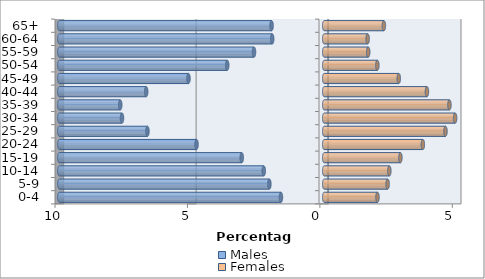
| Category | Males | Females |
|---|---|---|
| 0-4 | -1.634 | 2.011 |
| 5-9 | -2.071 | 2.394 |
| 10-14 | -2.283 | 2.459 |
| 15-19 | -3.113 | 2.876 |
| 20-24 | -4.821 | 3.724 |
| 25-29 | -6.674 | 4.578 |
| 30-34 | -7.635 | 4.942 |
| 35-39 | -7.701 | 4.727 |
| 40-44 | -6.721 | 3.878 |
| 45-49 | -5.124 | 2.814 |
| 50-54 | -3.662 | 2.006 |
| 55-59 | -2.65 | 1.661 |
| 60-64 | -1.964 | 1.639 |
| 65+ | -1.987 | 2.252 |